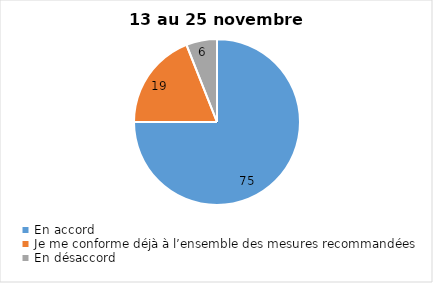
| Category | Series 0 |
|---|---|
| En accord | 75 |
| Je me conforme déjà à l’ensemble des mesures recommandées | 19 |
| En désaccord | 6 |